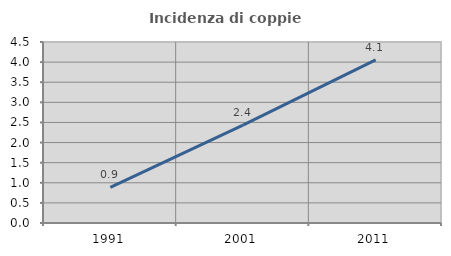
| Category | Incidenza di coppie miste |
|---|---|
| 1991.0 | 0.887 |
| 2001.0 | 2.432 |
| 2011.0 | 4.056 |